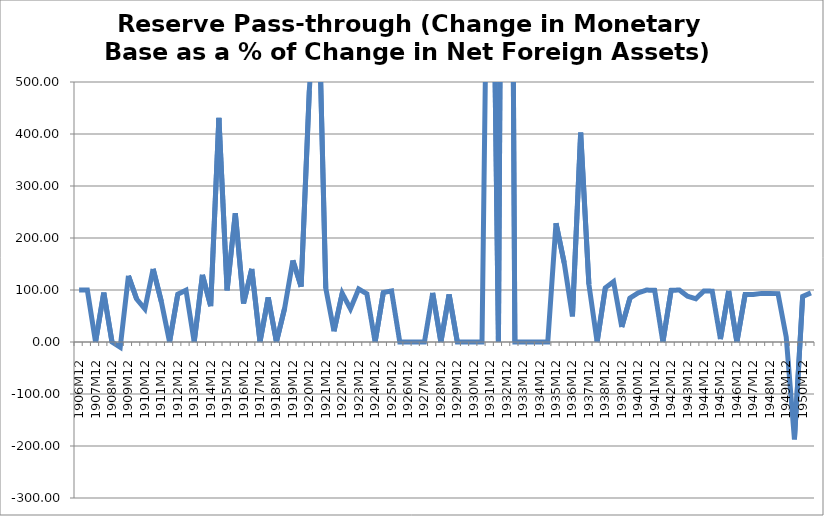
| Category | "Reserve Pass-through (Change in Net Foreign Assets as a % of Change in Monetary Base) (Discrete)" |
|---|---|
| 1906M12 | 100 |
| 1907M06 | 100 |
| 1907M12 | 0 |
| 1908M06 | 95.049 |
| 1908M12 | 0 |
| 1909M06 | -10.143 |
| 1909M12 | 127.253 |
| 1910M06 | 82.553 |
| 1910M12 | 63.511 |
| 1911M06 | 140.564 |
| 1911M12 | 77.558 |
| 1912M06 | 0 |
| 1912M12 | 91.754 |
| 1913M06 | 99.667 |
| 1913M12 | 0 |
| 1914M06 | 129.129 |
| 1914M12 | 68.796 |
| 1915M06 | 431.206 |
| 1915M12 | 99.336 |
| 1916M06 | 247.46 |
| 1916M12 | 74.031 |
| 1917M06 | 140.507 |
| 1917M12 | 0 |
| 1918M06 | 85.797 |
| 1918M12 | 0 |
| 1919M06 | 65.267 |
| 1919M12 | 156.891 |
| 1920M06 | 106.343 |
| 1920M12 | 483.699 |
| 1921M06 | 744.386 |
| 1921M12 | 103.431 |
| 1922M06 | 20.658 |
| 1922M12 | 93.602 |
| 1923M06 | 63.756 |
| 1923M12 | 101.916 |
| 1924M06 | 92.61 |
| 1924M12 | 0 |
| 1925M06 | 95.167 |
| 1925M12 | 98.161 |
| 1926M06 | 0 |
| 1926M12 | 0 |
| 1927M06 | 0 |
| 1927M12 | 0 |
| 1928M06 | 94.44 |
| 1928M12 | 0 |
| 1929M06 | 91.432 |
| 1929M12 | 0 |
| 1930M06 | 0 |
| 1930M12 | 0 |
| 1931M06 | 0 |
| 1931M12 | 1249.357 |
| 1932M06 | 0 |
| 1932M12 | 2735.784 |
| 1933M06 | 0 |
| 1933M12 | 0 |
| 1934M06 | 0 |
| 1934M12 | 0 |
| 1935M06 | 0 |
| 1935M12 | 228.366 |
| 1936M06 | 152.158 |
| 1936M12 | 49.202 |
| 1937M06 | 402.483 |
| 1937M12 | 111.063 |
| 1938M06 | 0 |
| 1938M12 | 104.159 |
| 1939M06 | 116.089 |
| 1939M12 | 28.939 |
| 1940M06 | 84.556 |
| 1940M12 | 94.507 |
| 1941M06 | 99.877 |
| 1941M12 | 99.371 |
| 1942M06 | 0 |
| 1942M12 | 99.36 |
| 1943M06 | 99.971 |
| 1943M12 | 88.022 |
| 1944M06 | 83.174 |
| 1944M12 | 98.231 |
| 1945M06 | 97.753 |
| 1945M12 | 5.642 |
| 1946M06 | 98.092 |
| 1946M12 | 0 |
| 1947M06 | 91.249 |
| 1947M12 | 91.249 |
| 1948M06 | 93.479 |
| 1948M12 | 93.479 |
| 1949M06 | 93.067 |
| 1949M12 | 9.329 |
| 1950M06 | -187.194 |
| 1950M12 | 87.581 |
| 1951M06 | 94.515 |